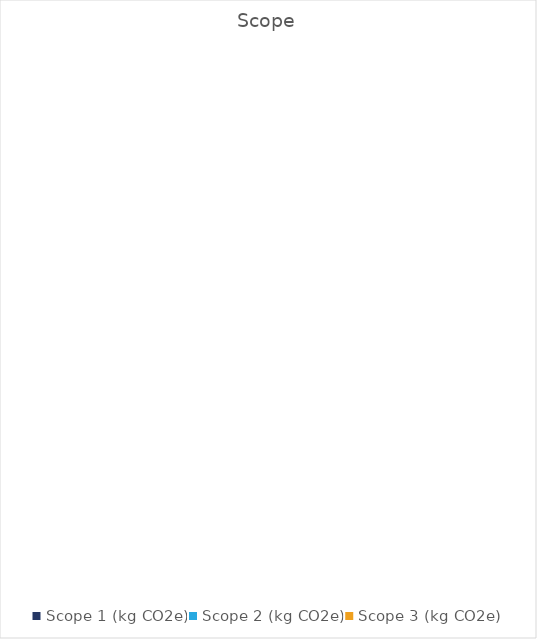
| Category | Series 0 |
|---|---|
| Scope 1 (kg CO2e) | 0 |
| Scope 2 (kg CO2e) | 0 |
| Scope 3 (kg CO2e) | 0 |